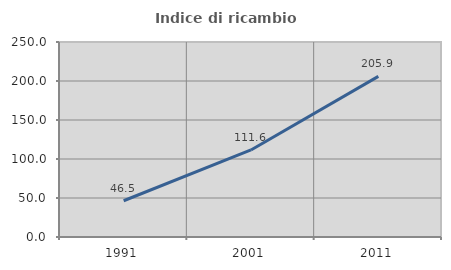
| Category | Indice di ricambio occupazionale  |
|---|---|
| 1991.0 | 46.486 |
| 2001.0 | 111.579 |
| 2011.0 | 205.882 |